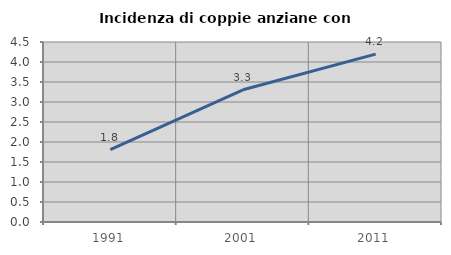
| Category | Incidenza di coppie anziane con figli |
|---|---|
| 1991.0 | 1.808 |
| 2001.0 | 3.305 |
| 2011.0 | 4.197 |